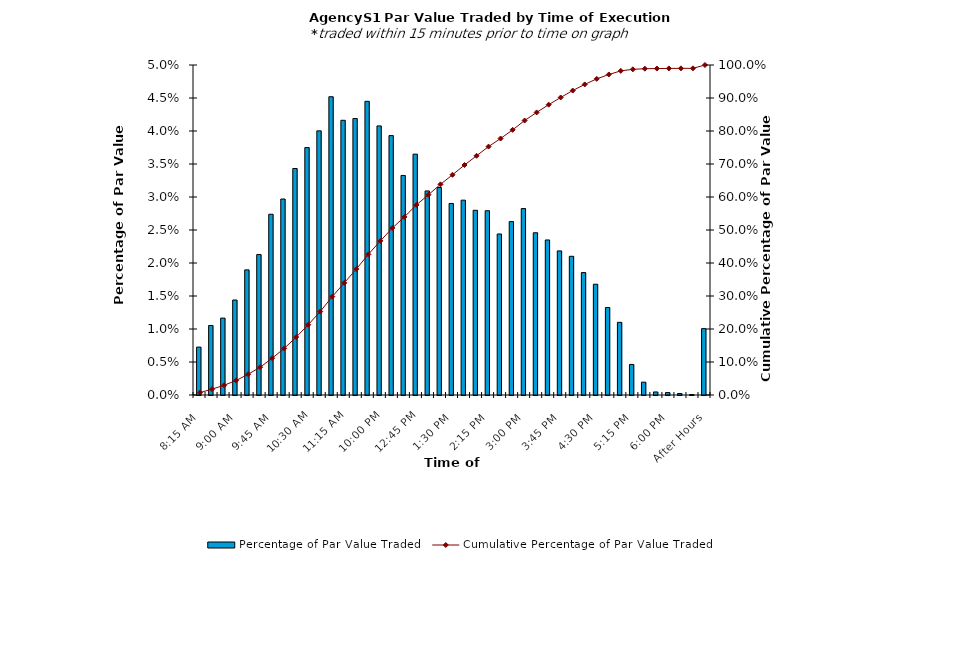
| Category | Percentage of Par Value Traded |
|---|---|
| 8:15 AM | 0.007 |
| 8:30 AM | 0.011 |
| 8:45 AM | 0.012 |
| 9:00 AM | 0.014 |
| 9:15 AM | 0.019 |
| 9:30 AM | 0.021 |
| 9:45 AM | 0.027 |
| 10:00 AM | 0.03 |
| 10:15 AM | 0.034 |
| 10:30 AM | 0.037 |
| 10:45 AM | 0.04 |
| 11:00 AM | 0.045 |
| 11:15 AM | 0.042 |
| 11:30 AM | 0.042 |
| 11:45 AM | 0.044 |
| 12:00 PM | 0.041 |
| 12:15 PM | 0.039 |
| 12:30 PM | 0.033 |
| 12:45 PM | 0.036 |
| 1:00 PM | 0.031 |
| 1:15 PM | 0.031 |
| 1:30 PM | 0.029 |
| 1:45 PM | 0.03 |
| 2:00 PM | 0.028 |
| 2:15 PM | 0.028 |
| 2:30 PM | 0.024 |
| 2:45 PM | 0.026 |
| 3:00 PM | 0.028 |
| 3:15 PM | 0.025 |
| 3:30 PM | 0.023 |
| 3:45 PM | 0.022 |
| 4:00 PM | 0.021 |
| 4:15 PM | 0.019 |
| 4:30 PM | 0.017 |
| 4:45 PM | 0.013 |
| 5:00 PM | 0.011 |
| 5:15 PM | 0.005 |
| 5:30 PM | 0.002 |
| 5:45 PM | 0 |
| 6:00 PM | 0 |
| 6:15 PM | 0 |
| 6:30 PM | 0 |
| After Hours | 0.01 |